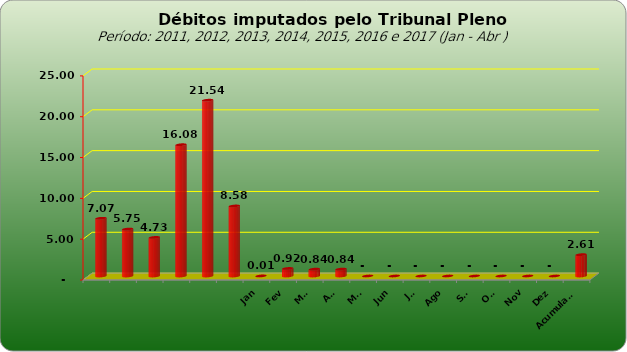
| Category |  7.073.154,74  |
|---|---|
|  | 7073154.74 |
|  | 5749129.25 |
|  | 4727033.51 |
|  | 16081820.48 |
|  | 21535723.6 |
|  | 8578266.09 |
| Jan | 7518 |
| Fev | 924330.96 |
| Mar | 840781.7 |
| Abr | 842058.28 |
| Mai | 0 |
| Jun | 0 |
| Jul | 0 |
| Ago | 0 |
| Set | 0 |
| Out | 0 |
| Nov | 0 |
| Dez | 0 |
| Acumulado | 2614688.94 |